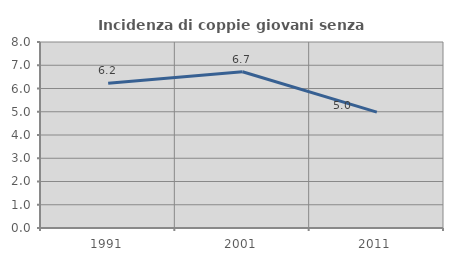
| Category | Incidenza di coppie giovani senza figli |
|---|---|
| 1991.0 | 6.231 |
| 2001.0 | 6.718 |
| 2011.0 | 4.984 |